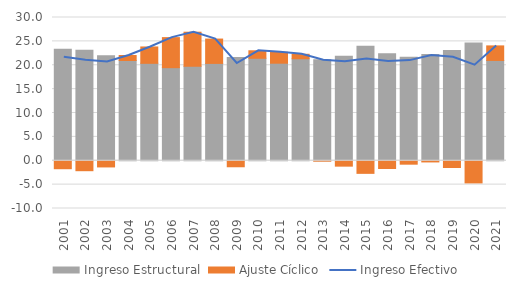
| Category | Ingreso Estructural | Ajuste Cíclico |
|---|---|---|
| 2001.0 | 23.368 | -1.669 |
| 2002.0 | 23.122 | -2.084 |
| 2003.0 | 21.965 | -1.295 |
| 2004.0 | 20.99 | 1.049 |
| 2005.0 | 20.403 | 3.427 |
| 2006.0 | 19.493 | 6.293 |
| 2007.0 | 19.79 | 7.129 |
| 2008.0 | 20.385 | 5.1 |
| 2009.0 | 21.619 | -1.259 |
| 2010.0 | 21.46 | 1.571 |
| 2011.0 | 20.429 | 2.289 |
| 2012.0 | 21.363 | 0.935 |
| 2013.0 | 21.128 | -0.082 |
| 2014.0 | 21.87 | -1.131 |
| 2015.0 | 23.966 | -2.64 |
| 2016.0 | 22.417 | -1.628 |
| 2017.0 | 21.692 | -0.72 |
| 2018.0 | 22.275 | -0.249 |
| 2019.0 | 23.076 | -1.419 |
| 2020.0 | 24.661 | -4.637 |
| 2021.0 | 21.005 | 3.049 |